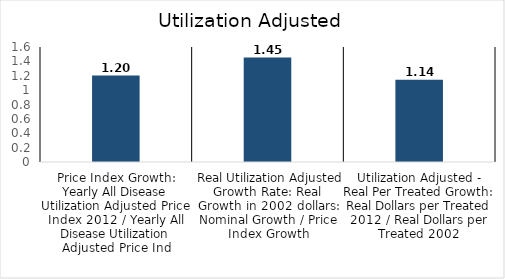
| Category | All Disease |
|---|---|
| Price Index Growth: Yearly All Disease Utilization Adjusted Price Index 2012 / Yearly All Disease Utilization Adjusted Price Ind | 1.203 |
|  Real Utilization Adjusted Growth Rate: Real Growth in 2002 dollars: Nominal Growth / Price Index Growth | 1.453 |
| Utilization Adjusted - Real Per Treated Growth: Real Dollars per Treated 2012 / Real Dollars per Treated 2002 | 1.144 |